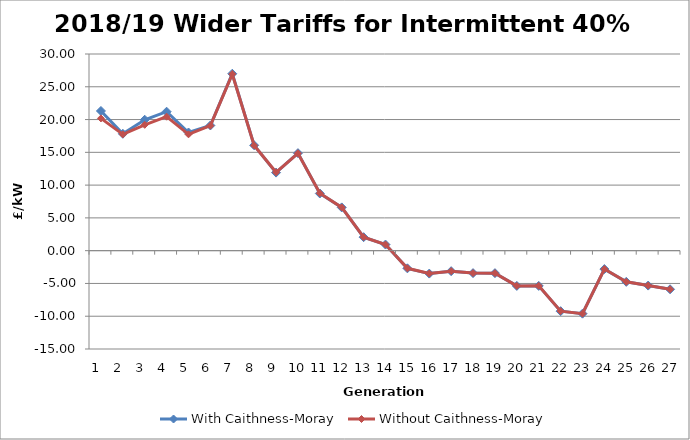
| Category | With Caithness-Moray | Without Caithness-Moray |
|---|---|---|
| 1.0 | 21.309 | 20.175 |
| 2.0 | 17.828 | 17.738 |
| 3.0 | 19.971 | 19.196 |
| 4.0 | 21.197 | 20.437 |
| 5.0 | 18.025 | 17.745 |
| 6.0 | 19.096 | 19.063 |
| 7.0 | 26.989 | 26.941 |
| 8.0 | 16.07 | 16.045 |
| 9.0 | 11.908 | 11.957 |
| 10.0 | 14.877 | 14.859 |
| 11.0 | 8.721 | 8.764 |
| 12.0 | 6.599 | 6.601 |
| 13.0 | 2.059 | 2.066 |
| 14.0 | 0.935 | 0.937 |
| 15.0 | -2.695 | -2.69 |
| 16.0 | -3.496 | -3.492 |
| 17.0 | -3.128 | -3.123 |
| 18.0 | -3.424 | -3.42 |
| 19.0 | -3.432 | -3.429 |
| 20.0 | -5.377 | -5.372 |
| 21.0 | -5.371 | -5.367 |
| 22.0 | -9.228 | -9.223 |
| 23.0 | -9.609 | -9.604 |
| 24.0 | -2.811 | -2.806 |
| 25.0 | -4.756 | -4.751 |
| 26.0 | -5.326 | -5.322 |
| 27.0 | -5.893 | -5.888 |